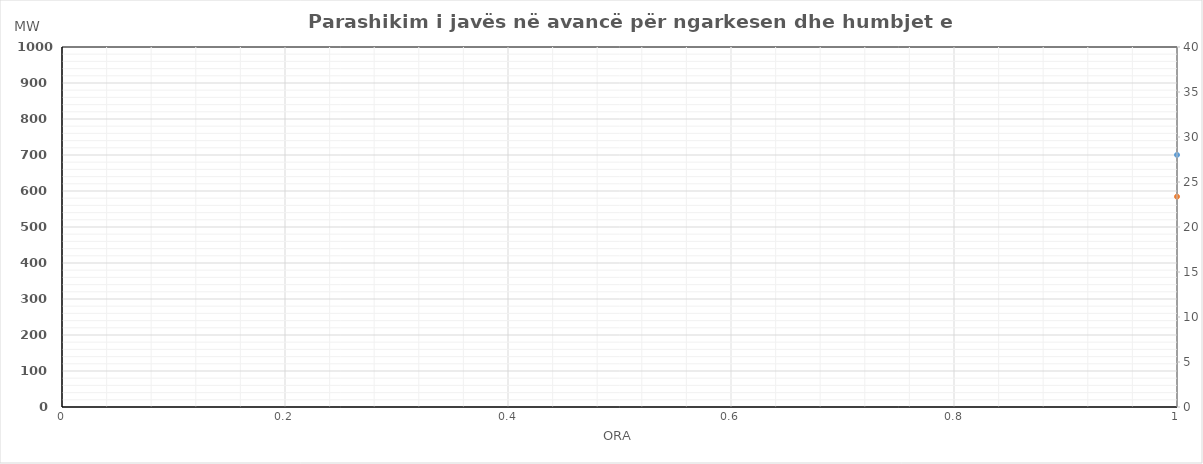
| Category | Ngarkesa (MWh) |
|---|---|
| 0 | 584.304 |
| 1 | 532.469 |
| 2 | 509.347 |
| 3 | 500.814 |
| 4 | 509.138 |
| 5 | 548.759 |
| 6 | 691.738 |
| 7 | 818.26 |
| 8 | 881.683 |
| 9 | 901.098 |
| 10 | 903.603 |
| 11 | 919.902 |
| 12 | 922.793 |
| 13 | 935.776 |
| 14 | 922.898 |
| 15 | 897.085 |
| 16 | 876.982 |
| 17 | 890.931 |
| 18 | 869.192 |
| 19 | 865.462 |
| 20 | 906.946 |
| 21 | 902.726 |
| 22 | 798.204 |
| 23 | 666.377 |
| 24 | 577.292 |
| 25 | 527.239 |
| 26 | 500.669 |
| 27 | 492.83 |
| 28 | 501.376 |
| 29 | 543.493 |
| 30 | 688.856 |
| 31 | 828.847 |
| 32 | 870.024 |
| 33 | 887.025 |
| 34 | 879.78 |
| 35 | 896.962 |
| 36 | 896.656 |
| 37 | 904.63 |
| 38 | 898.833 |
| 39 | 879.286 |
| 40 | 883.07 |
| 41 | 895.983 |
| 42 | 884.783 |
| 43 | 864.939 |
| 44 | 911.702 |
| 45 | 896.246 |
| 46 | 794.215 |
| 47 | 672.058 |
| 48 | 575.304 |
| 49 | 523.469 |
| 50 | 500.347 |
| 51 | 491.814 |
| 52 | 500.138 |
| 53 | 539.759 |
| 54 | 682.738 |
| 55 | 809.26 |
| 56 | 872.683 |
| 57 | 892.098 |
| 58 | 894.603 |
| 59 | 910.902 |
| 60 | 913.793 |
| 61 | 926.776 |
| 62 | 913.898 |
| 63 | 888.085 |
| 64 | 867.982 |
| 65 | 881.931 |
| 66 | 860.192 |
| 67 | 856.462 |
| 68 | 897.946 |
| 69 | 893.726 |
| 70 | 789.204 |
| 71 | 657.377 |
| 72 | 573.292 |
| 73 | 523.239 |
| 74 | 496.669 |
| 75 | 488.83 |
| 76 | 497.376 |
| 77 | 539.493 |
| 78 | 684.856 |
| 79 | 824.847 |
| 80 | 866.024 |
| 81 | 883.025 |
| 82 | 875.78 |
| 83 | 892.962 |
| 84 | 892.656 |
| 85 | 900.63 |
| 86 | 894.833 |
| 87 | 875.286 |
| 88 | 879.07 |
| 89 | 891.983 |
| 90 | 880.783 |
| 91 | 860.939 |
| 92 | 907.702 |
| 93 | 892.246 |
| 94 | 790.215 |
| 95 | 668.058 |
| 96 | 576.304 |
| 97 | 524.469 |
| 98 | 501.347 |
| 99 | 492.814 |
| 100 | 501.138 |
| 101 | 540.759 |
| 102 | 683.738 |
| 103 | 810.26 |
| 104 | 873.683 |
| 105 | 893.098 |
| 106 | 895.603 |
| 107 | 911.902 |
| 108 | 914.793 |
| 109 | 927.776 |
| 110 | 914.898 |
| 111 | 889.085 |
| 112 | 868.982 |
| 113 | 882.931 |
| 114 | 861.192 |
| 115 | 857.462 |
| 116 | 898.946 |
| 117 | 894.726 |
| 118 | 790.204 |
| 119 | 658.377 |
| 120 | 578.304 |
| 121 | 526.469 |
| 122 | 503.347 |
| 123 | 494.814 |
| 124 | 503.138 |
| 125 | 542.759 |
| 126 | 685.738 |
| 127 | 812.26 |
| 128 | 875.683 |
| 129 | 895.098 |
| 130 | 897.603 |
| 131 | 913.902 |
| 132 | 916.793 |
| 133 | 929.776 |
| 134 | 916.898 |
| 135 | 891.085 |
| 136 | 870.982 |
| 137 | 884.931 |
| 138 | 863.192 |
| 139 | 859.462 |
| 140 | 900.946 |
| 141 | 896.726 |
| 142 | 792.204 |
| 143 | 660.377 |
| 144 | 571.292 |
| 145 | 521.239 |
| 146 | 494.669 |
| 147 | 486.83 |
| 148 | 495.376 |
| 149 | 537.493 |
| 150 | 682.856 |
| 151 | 822.847 |
| 152 | 864.024 |
| 153 | 881.025 |
| 154 | 873.78 |
| 155 | 890.962 |
| 156 | 890.656 |
| 157 | 898.63 |
| 158 | 892.833 |
| 159 | 873.286 |
| 160 | 877.07 |
| 161 | 889.983 |
| 162 | 878.783 |
| 163 | 858.939 |
| 164 | 905.702 |
| 165 | 890.246 |
| 166 | 788.215 |
| 167 | 666.058 |